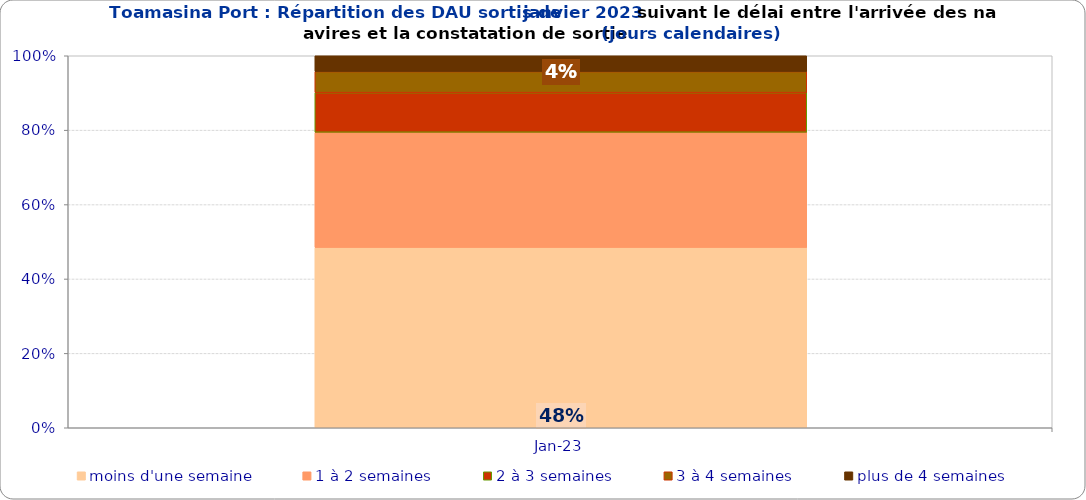
| Category | moins d'une semaine | 1 à 2 semaines | 2 à 3 semaines | 3 à 4 semaines | plus de 4 semaines |
|---|---|---|---|---|---|
| 2023-01-01 | 0.485 | 0.31 | 0.107 | 0.057 | 0.042 |